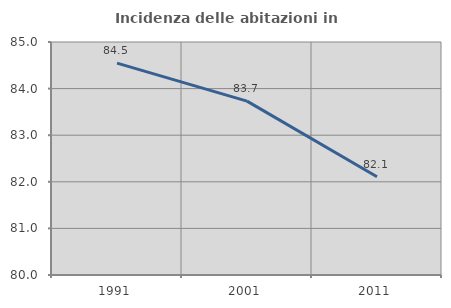
| Category | Incidenza delle abitazioni in proprietà  |
|---|---|
| 1991.0 | 84.545 |
| 2001.0 | 83.732 |
| 2011.0 | 82.109 |